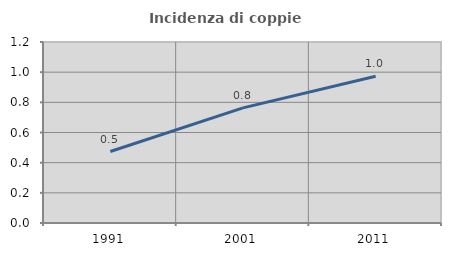
| Category | Incidenza di coppie miste |
|---|---|
| 1991.0 | 0.474 |
| 2001.0 | 0.763 |
| 2011.0 | 0.973 |